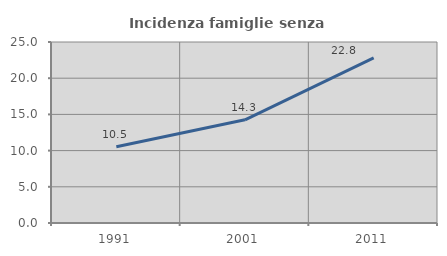
| Category | Incidenza famiglie senza nuclei |
|---|---|
| 1991.0 | 10.534 |
| 2001.0 | 14.257 |
| 2011.0 | 22.809 |